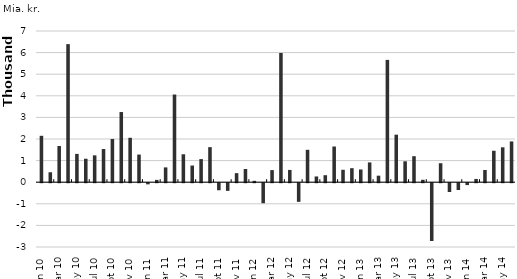
| Category | Transaktioner |
|---|---|
| 2010-01-01 | 2148269667.77 |
| 2010-02-01 | 460284819.01 |
| 2010-03-01 | 1675202190.089 |
| 2010-04-01 | 6391586927.811 |
| 2010-05-01 | 1310664306.043 |
| 2010-06-01 | 1085316670.43 |
| 2010-07-01 | 1242761803.838 |
| 2010-08-01 | 1535683807.799 |
| 2010-09-01 | 2001709324.72 |
| 2010-10-01 | 3248585393.582 |
| 2010-11-01 | 2056473693.186 |
| 2010-12-01 | 1279903981.456 |
| 2011-01-01 | -52895554.162 |
| 2011-02-01 | 106605575.991 |
| 2011-03-01 | 685323283.675 |
| 2011-04-01 | 4058701030.076 |
| 2011-05-01 | 1292756607.831 |
| 2011-06-01 | 771955936.435 |
| 2011-07-01 | 1069569629.031 |
| 2011-08-01 | 1623002340.989 |
| 2011-09-01 | -326707923.196 |
| 2011-10-01 | -355163409.365 |
| 2011-11-01 | 419583688.267 |
| 2011-12-01 | 612442088.339 |
| 2012-01-01 | 63424523.846 |
| 2012-02-01 | -926296721.069 |
| 2012-03-01 | 560268869.894 |
| 2012-04-01 | 5983327916.481 |
| 2012-05-01 | 568081983.084 |
| 2012-06-01 | -863118627.66 |
| 2012-07-01 | 1499931570.583 |
| 2012-08-01 | 265696247.049 |
| 2012-09-01 | 324295337.588 |
| 2012-10-01 | 1652274280.026 |
| 2012-11-01 | 575576432.042 |
| 2012-12-01 | 648714614.552 |
| 2013-01-01 | 590130898.175 |
| 2013-02-01 | 915700138.646 |
| 2013-03-01 | 301920360.756 |
| 2013-04-01 | 5662836257.944 |
| 2013-05-01 | 2200109879.579 |
| 2013-06-01 | 968329071.506 |
| 2013-07-01 | 1204135828.083 |
| 2013-08-01 | 111649576.062 |
| 2013-09-01 | -2675948323.783 |
| 2013-10-01 | 878054067.651 |
| 2013-11-01 | -406263744.917 |
| 2013-12-01 | -314283397.039 |
| 2014-01-01 | -87183065.078 |
| 2014-02-01 | 150345134.543 |
| 2014-03-01 | 565503568.39 |
| 2014-04-01 | 1455472609.868 |
| 2014-05-01 | 1614800834.071 |
| 2014-06-01 | 1888280690.963 |